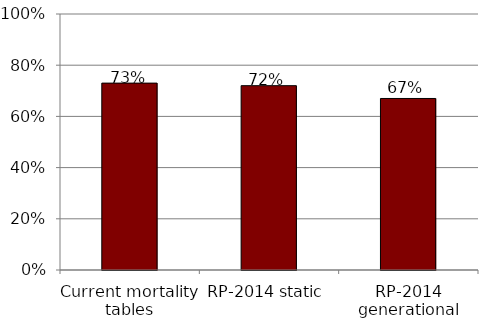
| Category | Funded Ratio |
|---|---|
| Current mortality tables | 0.73 |
| RP-2014 static | 0.72 |
| RP-2014 generational | 0.67 |